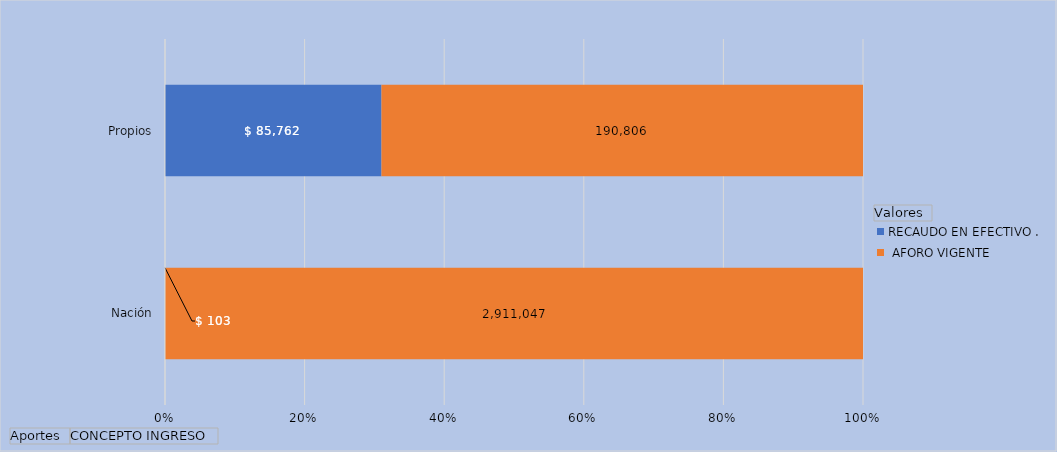
| Category | RECAUDO EN EFECTIVO . |  AFORO VIGENTE
 |
|---|---|---|
| Nación | 102.813 | 2911046.911 |
| Propios | 85762.141 | 190805.665 |